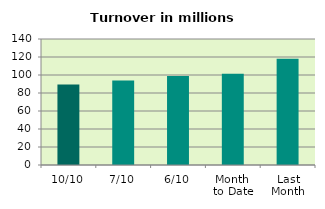
| Category | Series 0 |
|---|---|
| 10/10 | 89.557 |
| 7/10 | 93.858 |
| 6/10 | 98.863 |
| Month 
to Date | 101.455 |
| Last
Month | 117.918 |